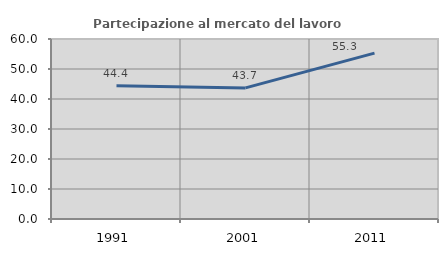
| Category | Partecipazione al mercato del lavoro  femminile |
|---|---|
| 1991.0 | 44.444 |
| 2001.0 | 43.697 |
| 2011.0 | 55.303 |